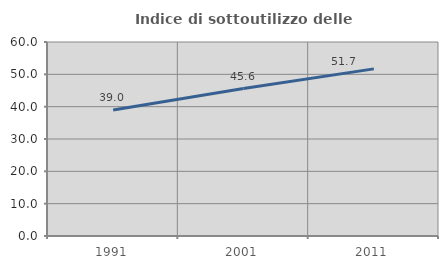
| Category | Indice di sottoutilizzo delle abitazioni  |
|---|---|
| 1991.0 | 38.965 |
| 2001.0 | 45.613 |
| 2011.0 | 51.685 |